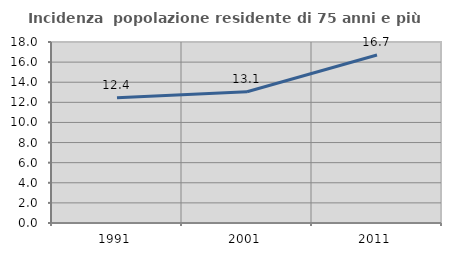
| Category | Incidenza  popolazione residente di 75 anni e più |
|---|---|
| 1991.0 | 12.447 |
| 2001.0 | 13.054 |
| 2011.0 | 16.711 |